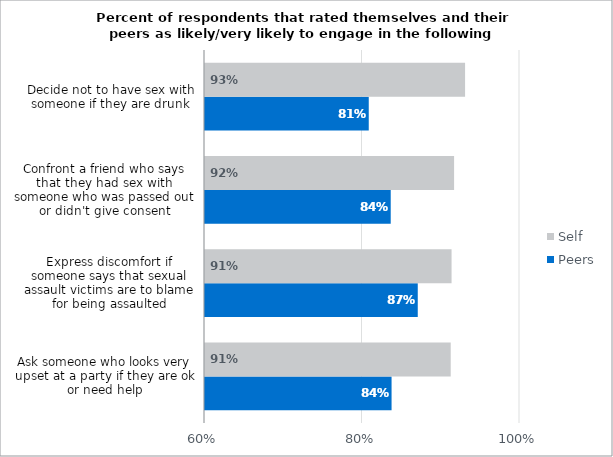
| Category | Peers | Self |
|---|---|---|
| Ask someone who looks very upset at a party if they are ok or need help | 0.837 | 0.912 |
| Express discomfort if someone says that sexual assault victims are to blame for being assaulted | 0.87 | 0.913 |
| Confront a friend who says that they had sex with someone who was passed out or didn't give consent | 0.836 | 0.916 |
| Decide not to have sex with someone if they are drunk | 0.808 | 0.93 |